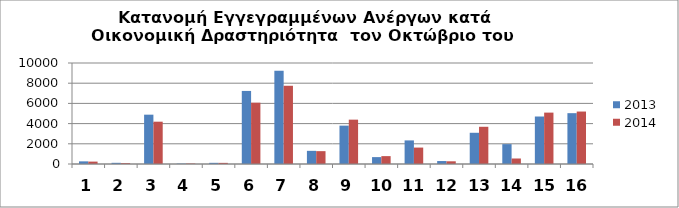
| Category | 2013 | 2014 |
|---|---|---|
| 0 | 262 | 237 |
| 1 | 117 | 86 |
| 2 | 4884 | 4189 |
| 3 | 37 | 45 |
| 4 | 116 | 112 |
| 5 | 7234 | 6071 |
| 6 | 9236 | 7746 |
| 7 | 1303 | 1272 |
| 8 | 3799 | 4391 |
| 9 | 682 | 780 |
| 10 | 2336 | 1626 |
| 11 | 293 | 267 |
| 12 | 3091 | 3685 |
| 13 | 1967 | 545 |
| 14 | 4702 | 5088 |
| 15 | 5033 | 5194 |